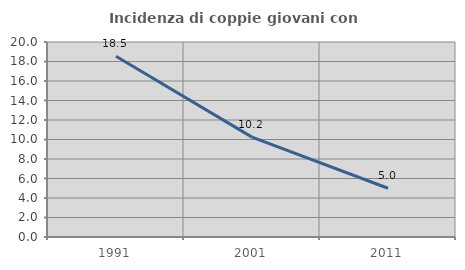
| Category | Incidenza di coppie giovani con figli |
|---|---|
| 1991.0 | 18.543 |
| 2001.0 | 10.241 |
| 2011.0 | 5 |